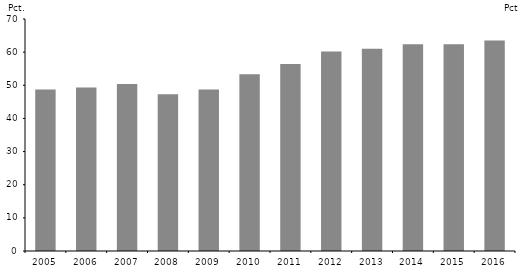
| Category | Andel, der søger mere end én uddannelse |
|---|---|
| 2005.0 | 48.7 |
| 2006.0 | 49.3 |
| 2007.0 | 50.4 |
| 2008.0 | 47.3 |
| 2009.0 | 48.7 |
| 2010.0 | 53.3 |
| 2011.0 | 56.4 |
| 2012.0 | 60.2 |
| 2013.0 | 61 |
| 2014.0 | 62.4 |
| 2015.0 | 62.4 |
| 2016.0 | 63.5 |